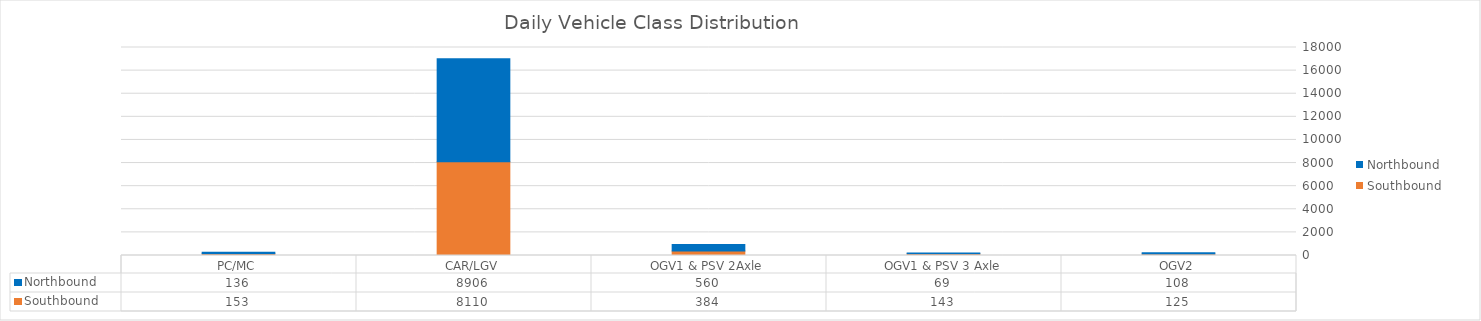
| Category | Southbound | Northbound |
|---|---|---|
| PC/MC | 153 | 136 |
| CAR/LGV | 8110 | 8906 |
| OGV1 & PSV 2Axle | 384 | 560 |
| OGV1 & PSV 3 Axle | 143 | 69 |
| OGV2 | 125 | 108 |